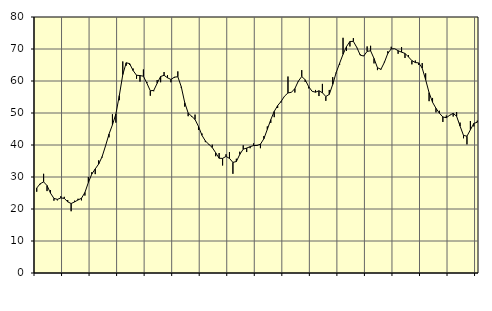
| Category | Piggar | Series 1 |
|---|---|---|
| nan | 25.4 | 26.55 |
| 87.0 | 27.7 | 27.89 |
| 87.0 | 31 | 28.47 |
| 87.0 | 25.6 | 27.33 |
| nan | 25.9 | 24.96 |
| 88.0 | 22.6 | 23.32 |
| 88.0 | 22.7 | 23.01 |
| 88.0 | 24 | 23.46 |
| nan | 23.8 | 23.32 |
| 89.0 | 22.8 | 22.25 |
| 89.0 | 19.3 | 21.71 |
| 89.0 | 22.6 | 22.22 |
| nan | 23.2 | 22.82 |
| 90.0 | 22.7 | 23.35 |
| 90.0 | 24.2 | 25.16 |
| 90.0 | 30 | 28.27 |
| nan | 31.5 | 30.92 |
| 91.0 | 30.9 | 32.52 |
| 91.0 | 35.2 | 34.06 |
| 91.0 | 36.1 | 36.36 |
| nan | 39.8 | 39.75 |
| 92.0 | 42.4 | 43.4 |
| 92.0 | 49.6 | 46.3 |
| 92.0 | 47 | 49.7 |
| nan | 54 | 55.46 |
| 93.0 | 66.1 | 61.99 |
| 93.0 | 64.8 | 65.7 |
| 93.0 | 65 | 65.42 |
| nan | 63.9 | 63.27 |
| 94.0 | 60.7 | 61.79 |
| 94.0 | 59.8 | 61.7 |
| 94.0 | 63.6 | 61.49 |
| nan | 59.7 | 59.33 |
| 95.0 | 55.4 | 56.95 |
| 95.0 | 56.8 | 57.05 |
| 95.0 | 60.3 | 59.3 |
| nan | 59.6 | 61.41 |
| 96.0 | 62.8 | 61.78 |
| 96.0 | 61.8 | 61.01 |
| 96.0 | 59.6 | 60.48 |
| nan | 61 | 61.2 |
| 97.0 | 63 | 61.33 |
| 97.0 | 57.9 | 58.2 |
| 97.0 | 52 | 53.24 |
| nan | 49 | 50 |
| 98.0 | 48.8 | 49 |
| 98.0 | 49.5 | 47.97 |
| 98.0 | 44.7 | 45.81 |
| nan | 43.6 | 43.05 |
| 99.0 | 40.9 | 41.26 |
| 99.0 | 40.1 | 40.22 |
| 99.0 | 40.1 | 39.21 |
| nan | 36.5 | 37.57 |
| 0.0 | 37.5 | 35.85 |
| 0.0 | 33.6 | 35.82 |
| 0.0 | 37.1 | 36.43 |
| nan | 37.8 | 35.82 |
| 1.0 | 31 | 34.57 |
| 1.0 | 35.7 | 34.83 |
| 1.0 | 37.9 | 37.06 |
| nan | 39.9 | 38.7 |
| 2.0 | 37.8 | 39.04 |
| 2.0 | 39 | 39.47 |
| 2.0 | 40.5 | 39.83 |
| nan | 40 | 39.86 |
| 3.0 | 39 | 40.25 |
| 3.0 | 42.8 | 41.96 |
| 3.0 | 45.8 | 44.88 |
| nan | 46.9 | 47.91 |
| 4.0 | 48.7 | 50.49 |
| 4.0 | 51.6 | 52.31 |
| 4.0 | 53.3 | 53.62 |
| nan | 55.3 | 55.26 |
| 5.0 | 61.4 | 56.27 |
| 5.0 | 56.5 | 56.47 |
| 5.0 | 56.4 | 57.62 |
| nan | 59.8 | 59.94 |
| 6.0 | 63.4 | 61.4 |
| 6.0 | 59.7 | 60.4 |
| 6.0 | 57.7 | 58.27 |
| nan | 56.8 | 56.79 |
| 7.0 | 57.2 | 56.5 |
| 7.0 | 55.3 | 56.95 |
| 7.0 | 59.1 | 56.33 |
| nan | 53.8 | 55.16 |
| 8.0 | 57.2 | 55.82 |
| 8.0 | 61.2 | 58.94 |
| 8.0 | 62.4 | 62.63 |
| nan | 65 | 65.54 |
| 9.0 | 73.5 | 68.34 |
| 9.0 | 69.4 | 70.74 |
| 9.0 | 70.8 | 72.35 |
| nan | 73.4 | 72.38 |
| 10.0 | 70.4 | 70.48 |
| 10.0 | 68.3 | 68.09 |
| 10.0 | 67.9 | 67.8 |
| nan | 70.8 | 69.26 |
| 11.0 | 71 | 69.44 |
| 11.0 | 65.5 | 67.04 |
| 11.0 | 63.4 | 64.16 |
| nan | 63.5 | 63.65 |
| 12.0 | 66 | 65.8 |
| 12.0 | 69.3 | 68.61 |
| 12.0 | 70.7 | 70.04 |
| nan | 70.1 | 70.1 |
| 13.0 | 68.5 | 69.46 |
| 13.0 | 70.6 | 69.02 |
| 13.0 | 67.2 | 68.62 |
| nan | 68.1 | 67.54 |
| 14.0 | 65.2 | 66.37 |
| 14.0 | 66.4 | 65.77 |
| 14.0 | 65 | 65.64 |
| nan | 65.6 | 64.01 |
| 15.0 | 62.4 | 60.4 |
| 15.0 | 53.7 | 56.35 |
| 15.0 | 54.7 | 53.36 |
| nan | 50.2 | 51.47 |
| 16.0 | 50.7 | 49.93 |
| 16.0 | 47.2 | 48.76 |
| 16.0 | 49.2 | 48.53 |
| nan | 49.2 | 49.31 |
| 17.0 | 48.9 | 49.91 |
| 17.0 | 50.3 | 48.96 |
| 17.0 | 47 | 45.91 |
| nan | 42.1 | 43 |
| 18.0 | 40.2 | 42.75 |
| 18.0 | 47.5 | 44.75 |
| 18.0 | 45.8 | 46.75 |
| nan | 47.6 | 47.12 |